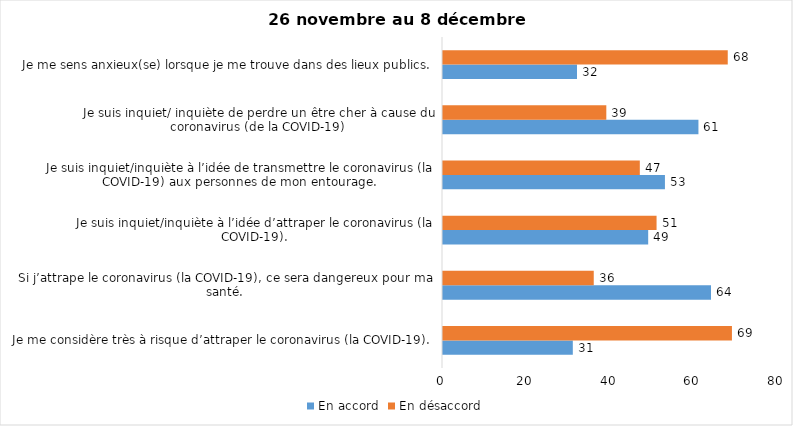
| Category | En accord | En désaccord |
|---|---|---|
| Je me considère très à risque d’attraper le coronavirus (la COVID-19). | 31 | 69 |
| Si j’attrape le coronavirus (la COVID-19), ce sera dangereux pour ma santé. | 64 | 36 |
| Je suis inquiet/inquiète à l’idée d’attraper le coronavirus (la COVID-19). | 49 | 51 |
| Je suis inquiet/inquiète à l’idée de transmettre le coronavirus (la COVID-19) aux personnes de mon entourage. | 53 | 47 |
| Je suis inquiet/ inquiète de perdre un être cher à cause du coronavirus (de la COVID-19) | 61 | 39 |
| Je me sens anxieux(se) lorsque je me trouve dans des lieux publics. | 32 | 68 |